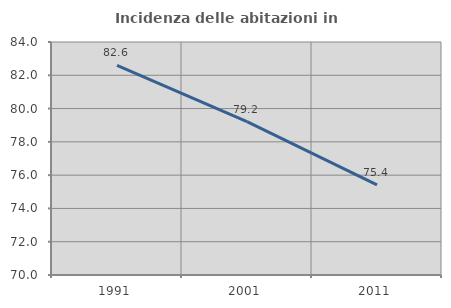
| Category | Incidenza delle abitazioni in proprietà  |
|---|---|
| 1991.0 | 82.59 |
| 2001.0 | 79.212 |
| 2011.0 | 75.41 |